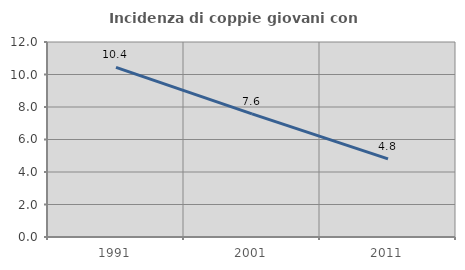
| Category | Incidenza di coppie giovani con figli |
|---|---|
| 1991.0 | 10.435 |
| 2001.0 | 7.576 |
| 2011.0 | 4.808 |